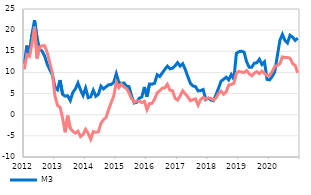
| Category | M3  | Domestic loans to the non-monetary sector |
|---|---|---|
| 2012-01-01 | 12.01 | 10.729 |
| 2012-02-01 | 16.354 | 14.221 |
| 2012-03-01 | 13.992 | 13.782 |
| 2012-04-01 | 18.952 | 16.69 |
| 2012-05-01 | 22.329 | 20.823 |
| 2012-06-01 | 18.134 | 13.296 |
| 2012-07-01 | 15.507 | 16.043 |
| 2012-08-01 | 15.015 | 16.313 |
| 2012-09-01 | 13.837 | 16.292 |
| 2012-10-01 | 11.912 | 14.641 |
| 2012-11-01 | 10.629 | 12.241 |
| 2012-12-01 | 9.421 | 9.834 |
| 2013-01-01 | 6.554 | 4.448 |
| 2013-02-01 | 5.916 | 2.211 |
| 2013-03-01 | 8.196 | 1.791 |
| 2013-04-01 | 4.809 | -0.816 |
| 2013-05-01 | 4.39 | -4.149 |
| 2013-06-01 | 4.482 | -0.203 |
| 2013-07-01 | 3.358 | -3.232 |
| 2013-08-01 | 5.277 | -3.913 |
| 2013-09-01 | 6.108 | -4.338 |
| 2013-10-01 | 7.502 | -3.897 |
| 2013-11-01 | 5.896 | -5.181 |
| 2013-12-01 | 4.573 | -4.65 |
| 2014-01-01 | 6.313 | -3.453 |
| 2014-02-01 | 4.038 | -4.43 |
| 2014-03-01 | 4.234 | -5.804 |
| 2014-04-01 | 5.797 | -3.993 |
| 2014-05-01 | 4.358 | -4.149 |
| 2014-06-01 | 4.845 | -4.035 |
| 2014-07-01 | 6.767 | -2.016 |
| 2014-08-01 | 6.108 | -1.198 |
| 2014-09-01 | 6.605 | -0.64 |
| 2014-10-01 | 7.075 | 1.254 |
| 2014-11-01 | 7.143 | 2.874 |
| 2014-12-01 | 7.648 | 4.423 |
| 2015-01-01 | 9.694 | 7.684 |
| 2015-02-01 | 7.639 | 6.418 |
| 2015-03-01 | 7.404 | 7.278 |
| 2015-04-01 | 7.508 | 6.557 |
| 2015-05-01 | 6.749 | 6.196 |
| 2015-06-01 | 6.629 | 5.14 |
| 2015-07-01 | 4.381 | 3.777 |
| 2015-08-01 | 2.769 | 2.955 |
| 2015-09-01 | 2.936 | 3.226 |
| 2015-10-01 | 3.902 | 3.199 |
| 2015-11-01 | 4.175 | 2.893 |
| 2015-12-01 | 6.564 | 3.196 |
| 2016-01-01 | 4.278 | 1.199 |
| 2016-02-01 | 7.267 | 2.638 |
| 2016-03-01 | 7.218 | 2.687 |
| 2016-04-01 | 7.458 | 3.711 |
| 2016-05-01 | 9.45 | 5.171 |
| 2016-06-01 | 9.03 | 5.69 |
| 2016-07-01 | 9.881 | 6.257 |
| 2016-08-01 | 10.715 | 6.355 |
| 2016-09-01 | 11.496 | 7.196 |
| 2016-10-01 | 10.853 | 5.785 |
| 2016-11-01 | 11.002 | 5.691 |
| 2016-12-01 | 11.553 | 3.906 |
| 2017-01-01 | 12.319 | 3.474 |
| 2017-02-01 | 11.489 | 4.47 |
| 2017-03-01 | 12.067 | 5.654 |
| 2017-04-01 | 10.696 | 4.923 |
| 2017-05-01 | 9.013 | 4.221 |
| 2017-06-01 | 7.423 | 3.312 |
| 2017-07-01 | 6.807 | 3.565 |
| 2017-08-01 | 6.642 | 3.755 |
| 2017-09-01 | 5.632 | 2.278 |
| 2017-10-01 | 5.691 | 3.574 |
| 2017-11-01 | 5.952 | 4.092 |
| 2017-12-01 | 3.567 | 3.671 |
| 2018-01-01 | 3.888 | 3.977 |
| 2018-02-01 | 3.511 | 3.859 |
| 2018-03-01 | 3.318 | 3.502 |
| 2018-04-01 | 4.689 | 3.953 |
| 2018-05-01 | 6.249 | 5.016 |
| 2018-06-01 | 7.929 | 5.586 |
| 2018-07-01 | 8.383 | 4.847 |
| 2018-08-01 | 8.861 | 5.412 |
| 2018-09-01 | 8.24 | 7.016 |
| 2018-10-31 | 9.483 | 7.163 |
| 2018-11-30 | 8.409 | 7.417 |
| 2018-12-31 | 14.522 | 9.795 |
| 2019-01-31 | 14.909 | 10.252 |
| 2019-02-28 | 15.018 | 10.086 |
| 2019-03-31 | 14.797 | 9.982 |
| 2019-04-30 | 12.506 | 10.444 |
| 2019-05-31 | 11.216 | 9.694 |
| 2019-06-30 | 11.23 | 9.224 |
| 2019-07-31 | 12.186 | 9.826 |
| 2019-08-31 | 12.279 | 10.177 |
| 2019-09-30 | 13.127 | 9.697 |
| 2019-10-31 | 11.864 | 10.311 |
| 2019-11-30 | 12.513 | 9.755 |
| 2019-12-31 | 8.354 | 9.245 |
| 2020-01-31 | 8.237 | 9.334 |
| 2020-02-29 | 9.035 | 10.229 |
| 2020-03-31 | 10.113 | 11.424 |
| 2020-04-30 | 13.811 | 11.641 |
| 2020-05-31 | 17.557 | 12.071 |
| 2020-06-30 | 18.995 | 13.679 |
| 2020-07-31 | 17.552 | 13.526 |
| 2020-08-31 | 16.965 | 13.505 |
| 2020-09-30 | 18.779 | 13.379 |
| 2020-10-31 | 18.356 | 12.108 |
| 2020-11-30 | 17.578 | 11.663 |
| 2020-12-31 | 18.104 | 9.901 |